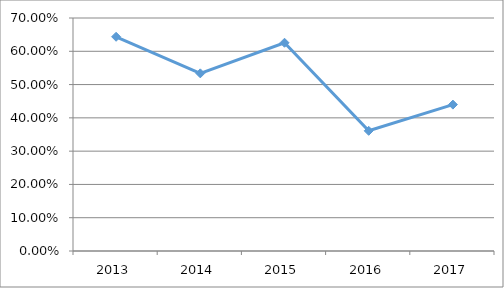
| Category | SIME-F4O12 |
|---|---|
| 2013.0 | 0.644 |
| 2014.0 | 0.534 |
| 2015.0 | 0.626 |
| 2016.0 | 0.361 |
| 2017.0 | 0.44 |